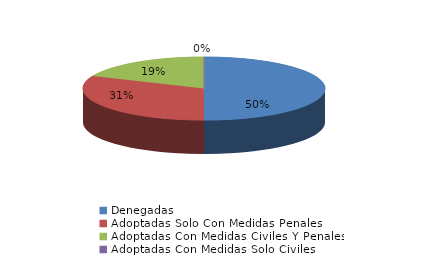
| Category | Series 0 |
|---|---|
| Denegadas | 62 |
| Adoptadas Solo Con Medidas Penales | 39 |
| Adoptadas Con Medidas Civiles Y Penales | 23 |
| Adoptadas Con Medidas Solo Civiles | 0 |